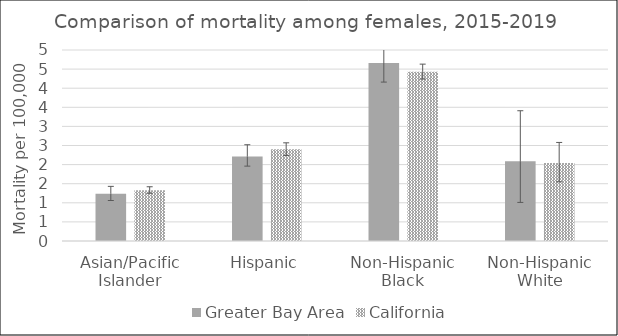
| Category | Greater Bay Area | California | US Mortality |
|---|---|---|---|
| Asian/Pacific Islander | 1.24 | 1.33 |  |
| Hispanic | 2.21 | 2.4 |  |
| Non-Hispanic Black | 4.66 | 4.43 |  |
| Non-Hispanic White | 2.09 | 2.04 |  |